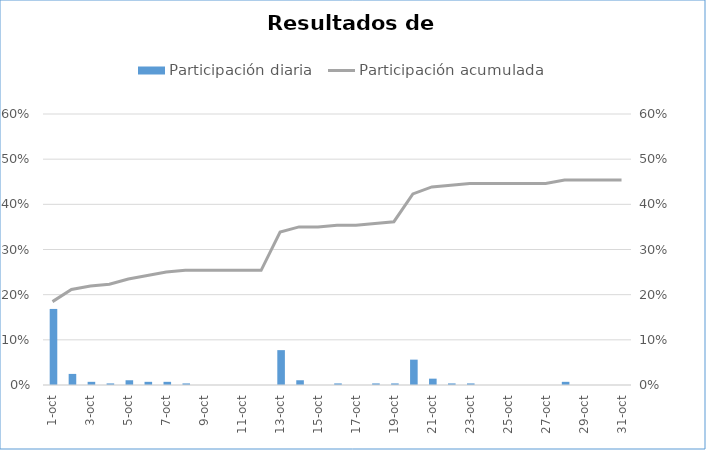
| Category | Participación diaria |
|---|---|
| 2020-10-01 | 0.168 |
| 2020-10-02 | 0.025 |
| 2020-10-03 | 0.007 |
| 2020-10-04 | 0.004 |
| 2020-10-05 | 0.011 |
| 2020-10-06 | 0.007 |
| 2020-10-07 | 0.007 |
| 2020-10-08 | 0.004 |
| 2020-10-09 | 0 |
| 2020-10-10 | 0 |
| 2020-10-11 | 0 |
| 2020-10-12 | 0 |
| 2020-10-13 | 0.077 |
| 2020-10-14 | 0.011 |
| 2020-10-15 | 0 |
| 2020-10-16 | 0.004 |
| 2020-10-17 | 0 |
| 2020-10-18 | 0.004 |
| 2020-10-19 | 0.004 |
| 2020-10-20 | 0.056 |
| 2020-10-21 | 0.014 |
| 2020-10-22 | 0.004 |
| 2020-10-23 | 0.004 |
| 2020-10-24 | 0 |
| 2020-10-25 | 0 |
| 2020-10-26 | 0 |
| 2020-10-27 | 0 |
| 2020-10-28 | 0.007 |
| 2020-10-29 | 0 |
| 2020-10-30 | 0 |
| 2020-10-31 | 0 |